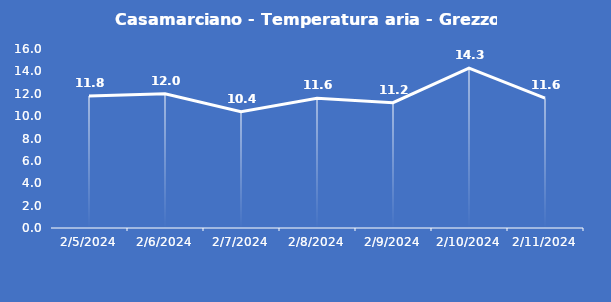
| Category | Casamarciano - Temperatura aria - Grezzo (°C) |
|---|---|
| 2/5/24 | 11.8 |
| 2/6/24 | 12 |
| 2/7/24 | 10.4 |
| 2/8/24 | 11.6 |
| 2/9/24 | 11.2 |
| 2/10/24 | 14.3 |
| 2/11/24 | 11.6 |